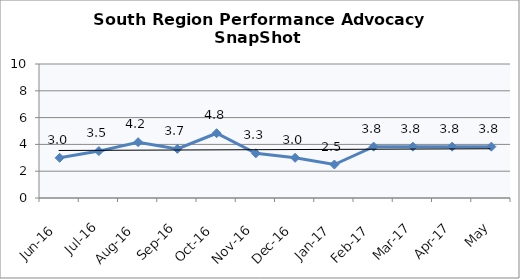
| Category | South Region |
|---|---|
| Jun-16 | 3 |
| Jul-16 | 3.5 |
| Aug-16 | 4.167 |
| Sep-16 | 3.667 |
| Oct-16 | 4.833 |
| Nov-16 | 3.333 |
| Dec-16 | 3 |
| Jan-17 | 2.5 |
| Feb-17 | 3.833 |
| Mar-17 | 3.833 |
| Apr-17 | 3.833 |
| May | 3.833 |